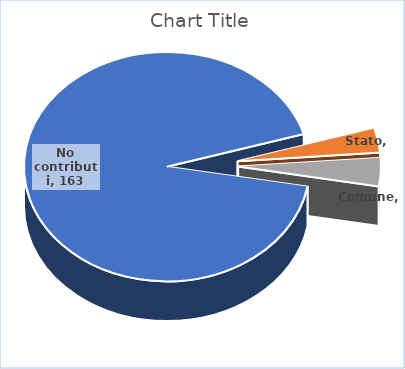
| Category | Series 0 |
|---|---|
| No contributi | 163 |
| Stato | 6 |
| Comune | 7 |